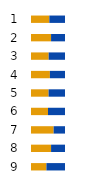
| Category | Series 0 | Series 1 |
|---|---|---|
| 0 | 54 | 46 |
| 1 | 59 | 41 |
| 2 | 52 | 48 |
| 3 | 55.576 | 44.424 |
| 4 | 51.74 | 48.26 |
| 5 | 49.95 | 50.05 |
| 6 | 66.617 | 33.383 |
| 7 | 59.022 | 40.978 |
| 8 | 45.349 | 54.651 |